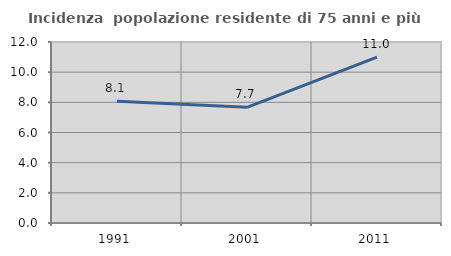
| Category | Incidenza  popolazione residente di 75 anni e più |
|---|---|
| 1991.0 | 8.069 |
| 2001.0 | 7.666 |
| 2011.0 | 10.995 |